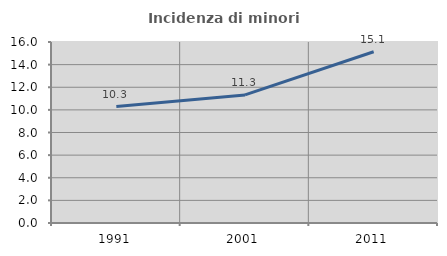
| Category | Incidenza di minori stranieri |
|---|---|
| 1991.0 | 10.294 |
| 2001.0 | 11.321 |
| 2011.0 | 15.142 |